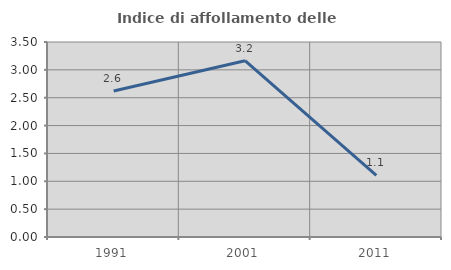
| Category | Indice di affollamento delle abitazioni  |
|---|---|
| 1991.0 | 2.622 |
| 2001.0 | 3.165 |
| 2011.0 | 1.104 |